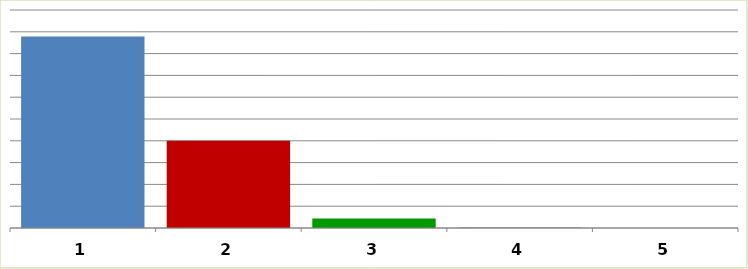
| Category | Series 0 |
|---|---|
| 0 | 43932838 |
| 1 | 20015000 |
| 2 | 2162118 |
| 3 | 130044 |
| 4 | 0 |